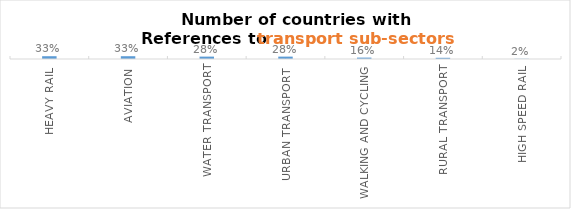
| Category | Series 0 |
|---|---|
| Heavy Rail | 0.326 |
| Aviation | 0.326 |
| Water transport | 0.279 |
| Urban Transport  | 0.279 |
| Walking and Cycling | 0.163 |
| Rural Transport | 0.14 |
| High Speed Rail | 0.023 |